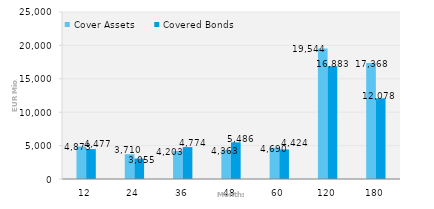
| Category | Cover Assets | Covered Bonds |
|---|---|---|
| 12.0 | 4873.356 | 4476.5 |
| 24.0 | 3710.239 | 3055 |
| 36.0 | 4202.803 | 4774.233 |
| 48.0 | 4363.144 | 5486.136 |
| 60.0 | 4690.368 | 4423.954 |
| 120.0 | 19543.81 | 16883.112 |
| 180.0 | 17367.732 | 12077.808 |